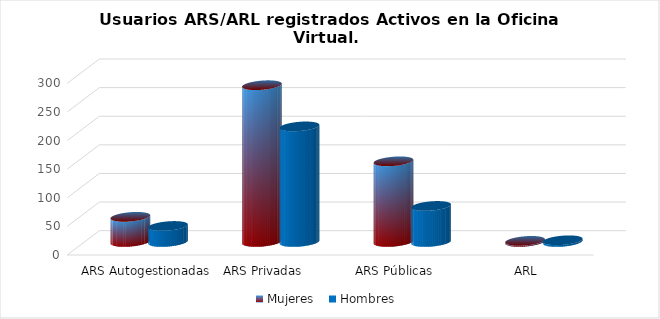
| Category | Mujeres | Hombres |
|---|---|---|
| ARS Autogestionadas | 44 | 28 |
| ARS Privadas | 274 | 202 |
| ARS Públicas | 141 | 63 |
| ARL | 2 | 3 |